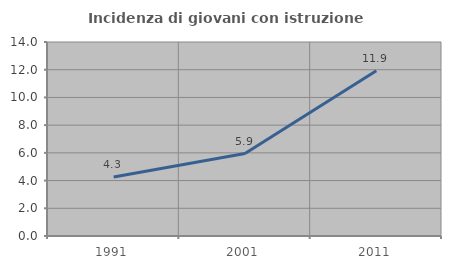
| Category | Incidenza di giovani con istruzione universitaria |
|---|---|
| 1991.0 | 4.257 |
| 2001.0 | 5.949 |
| 2011.0 | 11.927 |